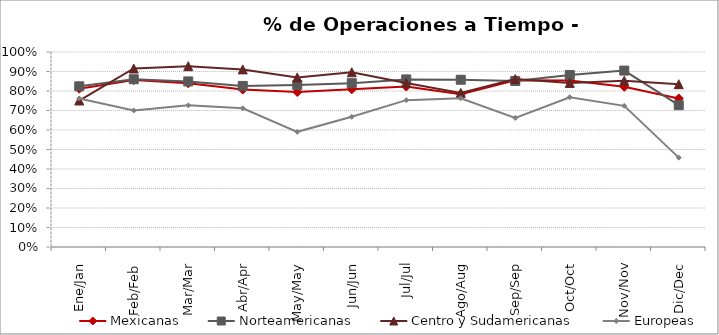
| Category | Mexicanas | Norteamericanas | Centro y Sudamericanas | Europeas |
|---|---|---|---|---|
| Ene/Jan | 0.812 | 0.824 | 0.751 | 0.762 |
| Feb/Feb | 0.856 | 0.86 | 0.915 | 0.7 |
| Mar/Mar | 0.839 | 0.849 | 0.927 | 0.726 |
| Abr/Apr | 0.807 | 0.826 | 0.911 | 0.711 |
| May/May | 0.795 | 0.831 | 0.869 | 0.591 |
| Jun/Jun | 0.809 | 0.84 | 0.896 | 0.668 |
| Jul/Jul | 0.823 | 0.859 | 0.841 | 0.753 |
| Ago/Aug | 0.784 | 0.858 | 0.79 | 0.763 |
| Sep/Sep | 0.855 | 0.852 | 0.861 | 0.662 |
| Oct/Oct | 0.854 | 0.882 | 0.841 | 0.768 |
| Nov/Nov | 0.822 | 0.905 | 0.853 | 0.724 |
| Dic/Dec | 0.762 | 0.727 | 0.835 | 0.458 |